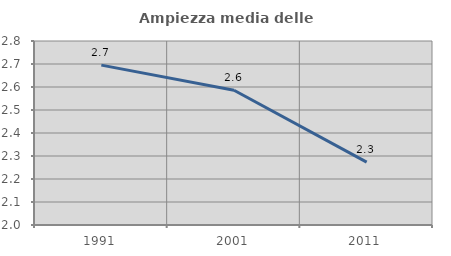
| Category | Ampiezza media delle famiglie |
|---|---|
| 1991.0 | 2.695 |
| 2001.0 | 2.586 |
| 2011.0 | 2.273 |